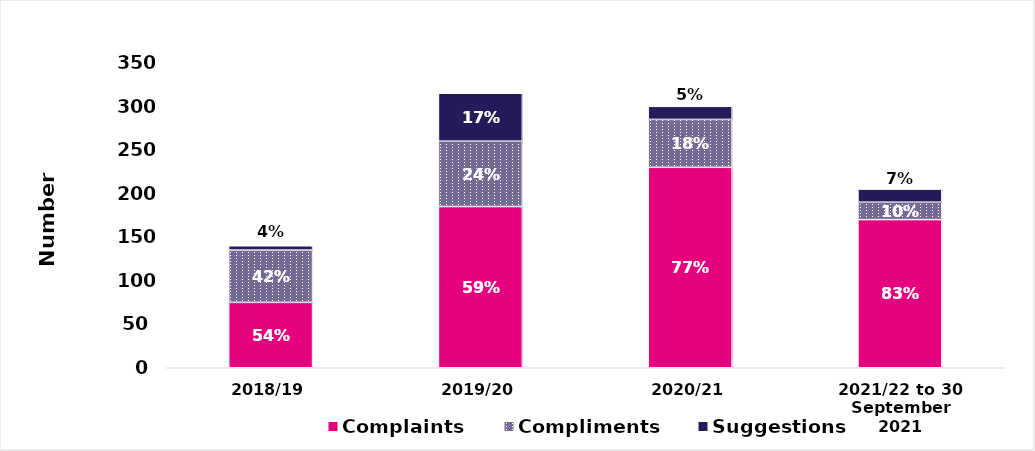
| Category | Complaints | Compliments | Suggestions |
|---|---|---|---|
| 2018/19 | 75 | 60 | 5 |
| 2019/20 | 185 | 75 | 55 |
| 2020/21 | 230 | 55 | 15 |
| 2021/22 to 30 September 2021 | 170 | 20 | 15 |